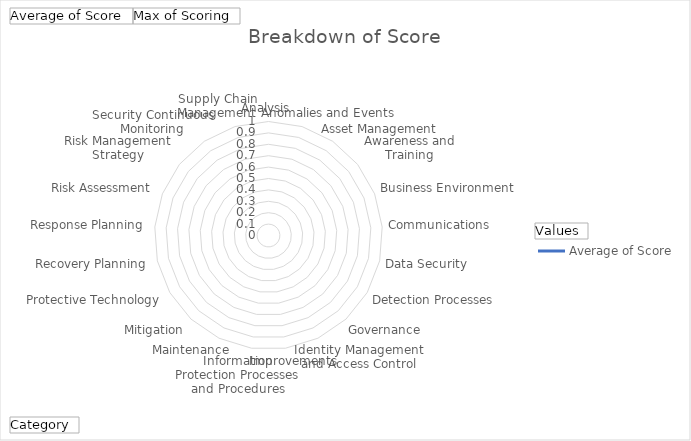
| Category | Average of Score | Max of Scoring |
|---|---|---|
| Analysis |  | 5 |
| Anomalies and Events |  | 5 |
| Asset Management |  | 5 |
| Awareness and Training |  | 5 |
| Business Environment |  | 5 |
| Communications |  | 5 |
| Data Security |  | 5 |
| Detection Processes |  | 5 |
| Governance |  | 5 |
| Identity Management and Access Control |  | 5 |
| Improvements |  | 5 |
| Information Protection Processes and Procedures |  | 5 |
| Maintenance |  | 5 |
| Mitigation |  | 5 |
| Protective Technology |  | 5 |
| Recovery Planning |  | 5 |
| Response Planning |  | 5 |
| Risk Assessment |  | 5 |
| Risk Management Strategy |  | 5 |
| Security Continuous Monitoring |  | 5 |
| Supply Chain Management |  | 5 |